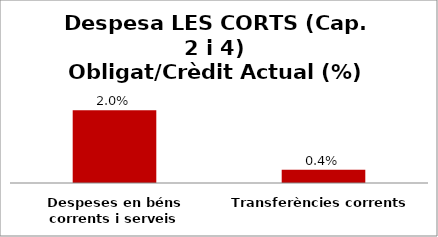
| Category | Series 0 |
|---|---|
| Despeses en béns corrents i serveis | 0.02 |
| Transferències corrents | 0.004 |